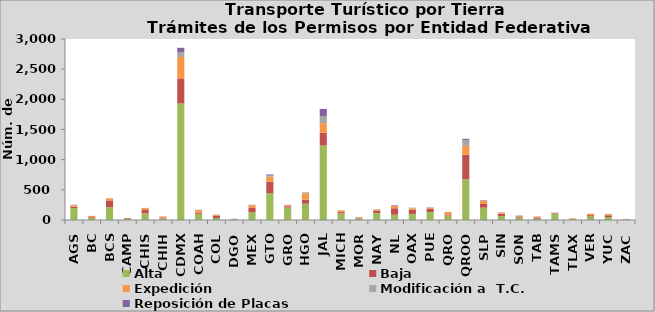
| Category | Alta                                         | Baja | Expedición | Modificación a  T.C. | Reposición de Placas | Otros |
|---|---|---|---|---|---|---|
| AGS | 199 | 20 | 25 | 2 | 6 |  |
| BC | 36 | 12 | 19 | 1 | 0 |  |
| BCS | 212 | 113 | 33 | 3 | 1 |  |
| CAMP | 20 | 11 | 2 | 0 | 0 |  |
| CHIS | 109 | 66 | 24 | 2 | 0 |  |
| CHIH | 27 | 16 | 15 | 0 | 1 |  |
| CDMX | 1932 | 415 | 353 | 81 | 73 |  |
| COAH | 102 | 21 | 41 | 5 | 1 |  |
| COL | 33 | 39 | 13 | 5 | 1 |  |
| DGO | 11 | 6 | 1 | 0 | 2 |  |
| MEX | 129 | 70 | 45 | 2 | 6 |  |
| GTO | 444 | 191 | 82 | 20 | 18 |  |
| GRO | 206 | 23 | 16 | 6 | 1 |  |
| HGO | 270 | 68 | 105 | 13 | 3 |  |
| JAL | 1236 | 210 | 159 | 111 | 125 |  |
| MICH | 108 | 23 | 26 | 3 | 1 |  |
| MOR | 28 | 11 | 8 | 4 | 0 |  |
| NAY | 114 | 41 | 17 | 1 | 4 |  |
| NL | 88 | 107 | 37 | 7 | 7 |  |
| OAX | 101 | 65 | 26 | 11 | 2 |  |
| PUE | 133 | 52 | 21 | 1 | 3 |  |
| QRO | 75 | 17 | 42 | 1 | 0 |  |
| QROO | 673 | 408 | 148 | 98 | 19 |  |
| SLP | 204 | 63 | 53 | 7 | 4 |  |
| SIN | 67 | 37 | 18 | 2 | 2 |  |
| SON | 41 | 19 | 9 | 4 | 3 |  |
| TAB | 20 | 22 | 16 | 2 | 0 |  |
| TAMS | 100 | 11 | 4 | 2 | 4 |  |
| TLAX | 15 | 5 | 9 | 0 | 0 |  |
| VER | 58 | 23 | 22 | 0 | 1 |  |
| YUC | 50 | 28 | 20 | 3 | 0 |  |
| ZAC | 6 | 7 | 5 | 0 | 0 |  |